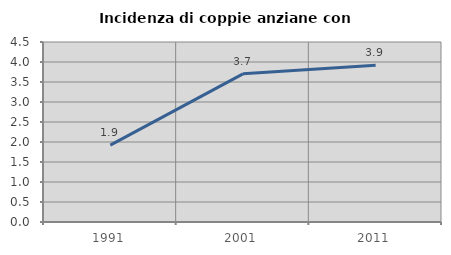
| Category | Incidenza di coppie anziane con figli |
|---|---|
| 1991.0 | 1.923 |
| 2001.0 | 3.704 |
| 2011.0 | 3.922 |